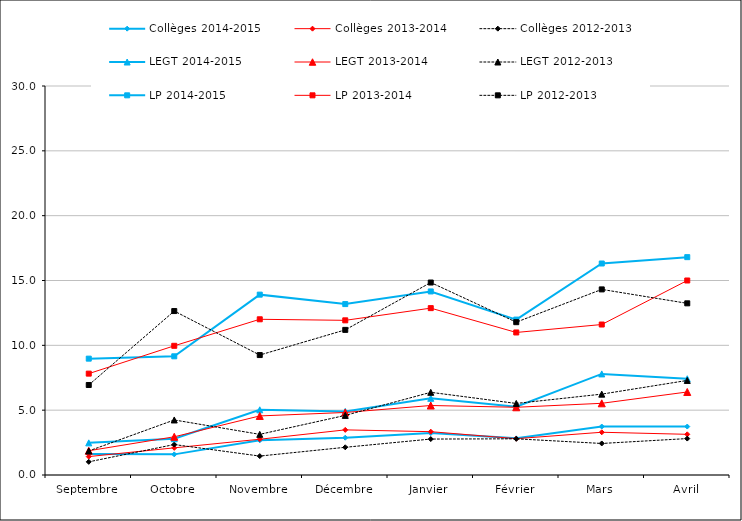
| Category | Collèges 2014-2015 | Collèges 2013-2014 | Collèges 2012-2013 | LEGT 2014-2015 | LEGT 2013-2014 | LEGT 2012-2013 | LP 2014-2015 | LP 2013-2014 | LP 2012-2013 |
|---|---|---|---|---|---|---|---|---|---|
| Septembre | 1.623 | 1.421 | 1.015 | 2.478 | 1.871 | 1.854 | 8.973 | 7.818 | 6.942 |
| Octobre | 1.591 | 2.094 | 2.349 | 2.797 | 2.947 | 4.245 | 9.154 | 9.964 | 12.643 |
| Novembre | 2.677 | 2.758 | 1.46 | 5.028 | 4.555 | 3.135 | 13.909 | 12.008 | 9.251 |
| Décembre | 2.874 | 3.481 | 2.137 | 4.906 | 4.821 | 4.597 | 13.181 | 11.928 | 11.192 |
| Janvier | 3.237 | 3.341 | 2.772 | 5.915 | 5.36 | 6.376 | 14.156 | 12.869 | 14.844 |
| Février | 2.826 | 2.802 | 2.791 | 5.26 | 5.223 | 5.518 | 11.985 | 10.993 | 11.786 |
| Mars | 3.738 | 3.296 | 2.432 | 7.797 | 5.529 | 6.237 | 16.31 | 11.605 | 14.313 |
| Avril | 3.736 | 3.138 | 2.809 | 7.425 | 6.403 | 7.293 | 16.801 | 15.001 | 13.239 |